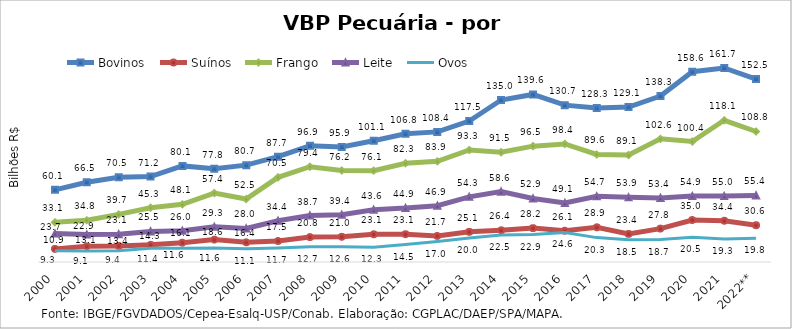
| Category | Bovinos | Suínos | Frango | Leite | Ovos |
|---|---|---|---|---|---|
| 2000 | 60.123 | 10.886 | 33.083 | 23.748 | 9.285 |
| 2001 | 66.46 | 13.06 | 34.773 | 22.852 | 9.15 |
| 2002 | 70.527 | 13.386 | 39.692 | 23.14 | 9.427 |
| 2003 | 71.18 | 14.306 | 45.252 | 25.482 | 11.403 |
| 2004 | 80.086 | 16.084 | 48.052 | 26.044 | 11.557 |
| 2005 | 77.752 | 18.648 | 57.449 | 29.292 | 11.636 |
| 2006 | 80.726 | 16.404 | 52.482 | 27.979 | 11.053 |
| 2007 | 87.73 | 17.541 | 70.515 | 34.395 | 11.747 |
| 2008 | 96.864 | 20.77 | 79.377 | 38.693 | 12.686 |
| 2009 | 95.854 | 20.996 | 76.213 | 39.448 | 12.649 |
| 2010 | 101.059 | 23.097 | 76.121 | 43.565 | 12.303 |
| 2011 | 106.835 | 23.133 | 82.328 | 44.91 | 14.497 |
| 2012 | 108.427 | 21.721 | 83.865 | 46.929 | 16.994 |
| 2013 | 117.497 | 25.15 | 93.342 | 54.306 | 19.987 |
| 2014 | 134.983 | 26.415 | 91.455 | 58.644 | 22.456 |
| 2015 | 139.628 | 28.23 | 96.548 | 52.936 | 22.864 |
| 2016 | 130.699 | 26.052 | 98.375 | 49.118 | 24.65 |
| 2017 | 128.258 | 28.92 | 89.603 | 54.728 | 20.318 |
| 2018 | 129.118 | 23.421 | 89.114 | 53.915 | 18.476 |
| 2019 | 138.256 | 27.839 | 102.606 | 53.415 | 18.711 |
| 2020 | 158.589 | 34.993 | 100.387 | 54.918 | 20.549 |
| 2021 | 161.719 | 34.37 | 118.094 | 54.979 | 19.256 |
| 2022** | 152.462 | 30.645 | 108.755 | 55.435 | 19.805 |